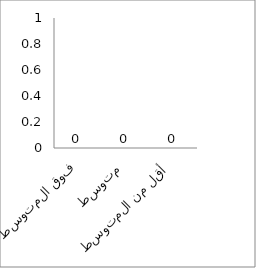
| Category | العدد |
|---|---|
| فوق المتوسط | 0 |
| متوسط | 0 |
| أقل من المتوسط | 0 |